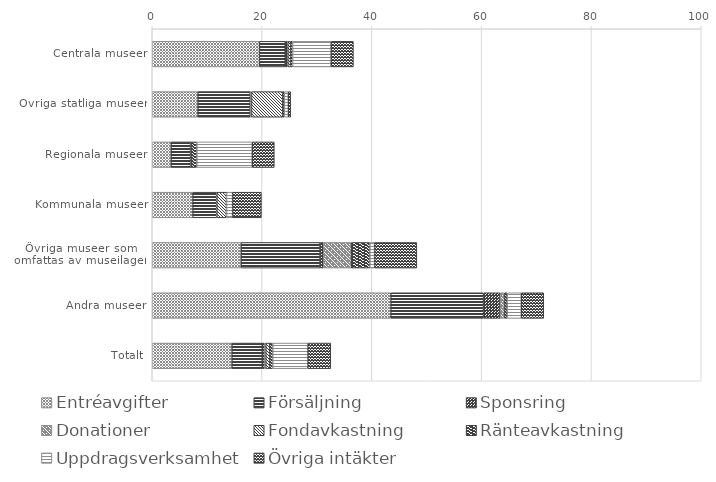
| Category | Entréavgifter | Försäljning | Sponsring | Donationer | Fondavkastning | Ränteavkastning | Uppdragsverksamhet | Övriga intäkter |
|---|---|---|---|---|---|---|---|---|
| Centrala museer | 19.521 | 4.698 | 0.374 | 0.114 | 0.492 | 0.368 | 7.004 | 4.072 |
| Övriga statliga museer | 8.308 | 9.548 | 0 | 0.226 | 5.678 | 0.297 | 0.716 | 0.444 |
| Regionala museer | 3.432 | 3.546 | 0.019 | 0.035 | 0.102 | 0.988 | 10.079 | 4.03 |
| Kommunala museer | 7.376 | 4.366 | 0.007 | 0.023 | 1.749 | 0.017 | 1.096 | 5.248 |
| Övriga museer som 
omfattas av museilagen | 16.18 | 14.4 | 0.577 | 5.106 | 0 | 3.386 | 0.85 | 7.694 |
| Andra museer | 43.454 | 16.898 | 3.021 | 0.784 | 0 | 0.493 | 2.568 | 4.098 |
| Totalt | 14.511 | 5.536 | 0.389 | 0.248 | 0.702 | 0.569 | 6.387 | 4.174 |